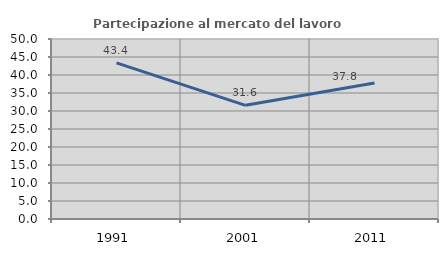
| Category | Partecipazione al mercato del lavoro  femminile |
|---|---|
| 1991.0 | 43.371 |
| 2001.0 | 31.577 |
| 2011.0 | 37.765 |